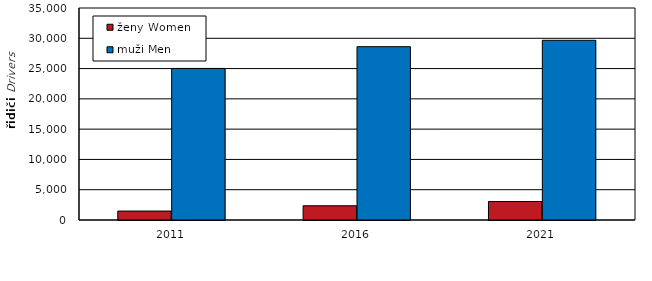
| Category | ženy | muži |
|---|---|---|
| 2011.0 | 1477 | 25022 |
| 2016.0 | 2348 | 28614 |
| 2021.0 | 3054 | 29669 |